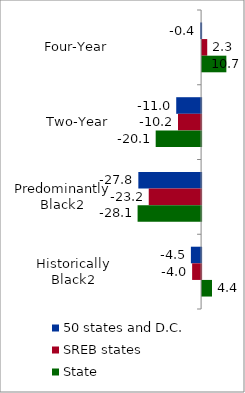
| Category | 50 states and D.C. | SREB states | State |
|---|---|---|---|
| Four-Year | -0.35 | 2.267 | 10.734 |
| Two-Year | -11.008 | -10.217 | -20.096 |
| Predominantly Black2 | -27.769 | -23.168 | -28.105 |
| Historically Black2 | -4.517 | -3.968 | 4.382 |